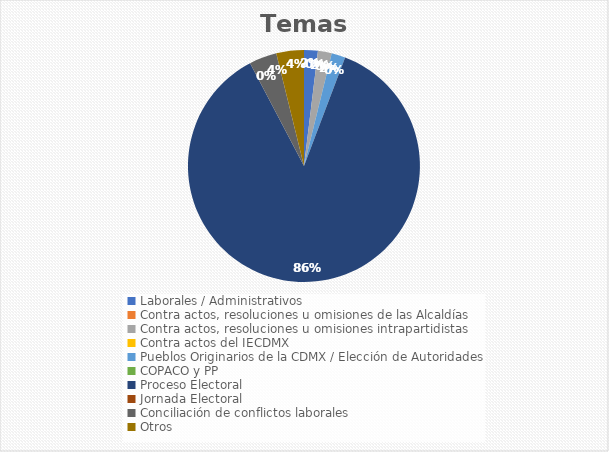
| Category | Temas |
|---|---|
| Laborales / Administrativos | 1 |
| Contra actos, resoluciones u omisiones de las Alcaldías | 0 |
| Contra actos, resoluciones u omisiones intrapartidistas | 1 |
| Contra actos del IECDMX | 0 |
| Pueblos Originarios de la CDMX / Elección de Autoridades | 1 |
| COPACO y PP | 0 |
| Proceso Electoral | 45 |
| Jornada Electoral | 0 |
| Conciliación de conflictos laborales | 2 |
| Otros | 2 |